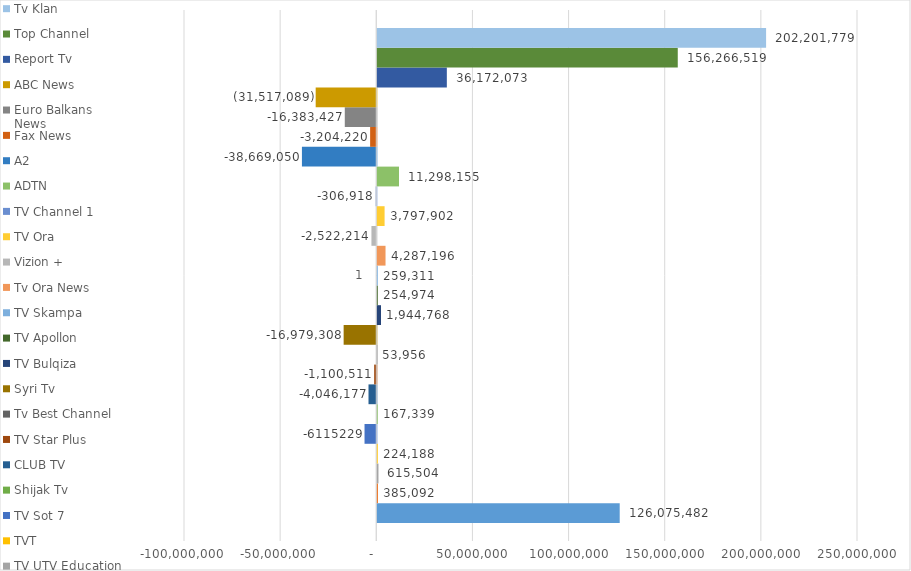
| Category | Digitalb TV | TV Scan | TV UTV Education | TVT | TV Sot 7 | Shijak Tv | CLUB TV | TV Star Plus | Tv Best Channel | Syri Tv | TV Bulqiza | TV Apollon | TV Skampa | Tv Ora News | Vizion + | TV Ora | TV Channel 1 | ADTN | A2 | Fax News | Euro Balkans News | ABC News | Report Tv | Top Channel | Tv Klan  |
|---|---|---|---|---|---|---|---|---|---|---|---|---|---|---|---|---|---|---|---|---|---|---|---|---|---|
| 0 | 126075482 | 385092 | 615504 | 224188 | -6115229 | 167339 | -4046177 | -1100511 | 53956 | -16979308 | 1944768 | 254974.3 | 259311 | 4287196 | -2522214 | 3797902 | -306918 | 11298155 | -38669050 | -3204220 | -16383427 | -31517089 | 36172073 | 156266519 | 202201779 |